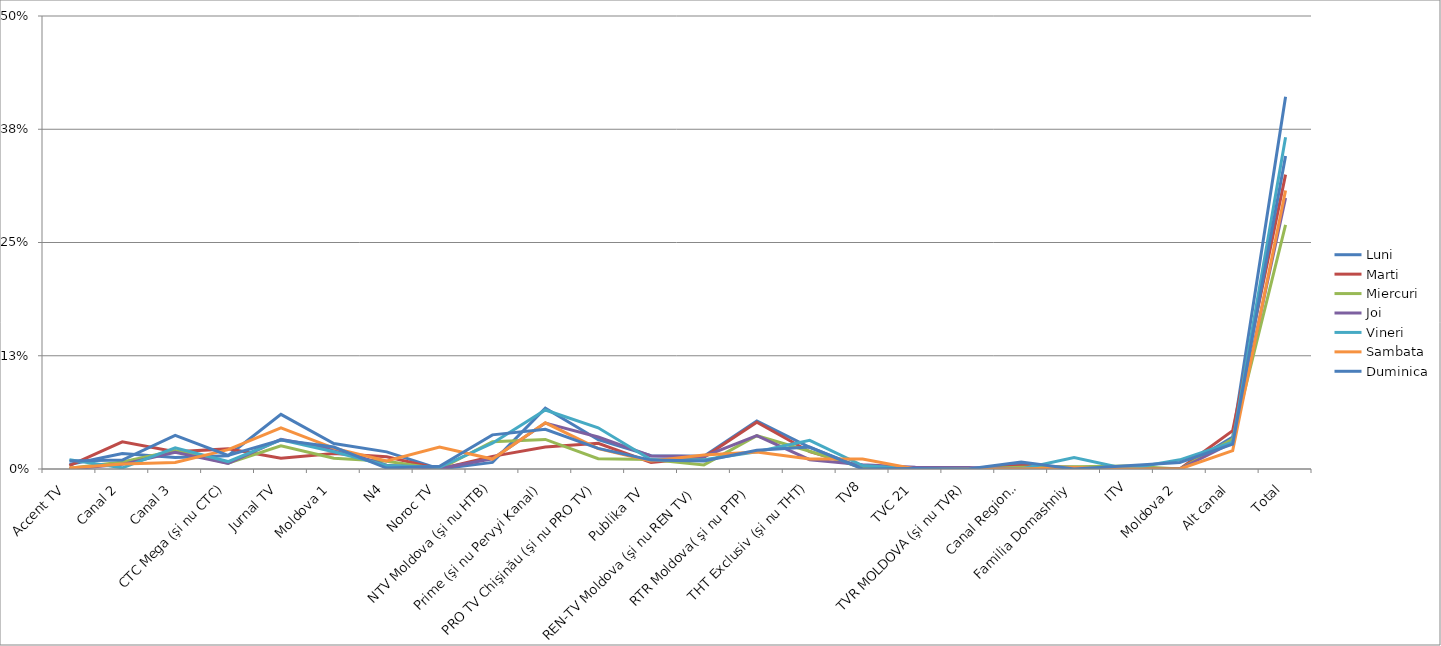
| Category | Luni | Marti | Miercuri | Joi | Vineri | Sambata | Duminica |
|---|---|---|---|---|---|---|---|
| Accent TV | 0.005 | 0.004 | 0.001 | 0 | 0.01 | 0.001 | 0.009 |
| Canal 2 | 0.017 | 0.03 | 0.008 | 0.005 | 0.001 | 0.005 | 0.01 |
| Canal 3 | 0.013 | 0.019 | 0.02 | 0.018 | 0.023 | 0.007 | 0.037 |
| CTC Mega (şi nu CTC) | 0.015 | 0.022 | 0.007 | 0.006 | 0.008 | 0.021 | 0.015 |
| Jurnal TV | 0.06 | 0.012 | 0.026 | 0.033 | 0.032 | 0.045 | 0.032 |
| Moldova 1 | 0.028 | 0.017 | 0.012 | 0.022 | 0.019 | 0.023 | 0.024 |
| N4 | 0.019 | 0.013 | 0.009 | 0.004 | 0.004 | 0.009 | 0.001 |
| Noroc TV | 0 | 0 | 0 | 0.001 | 0.002 | 0.024 | 0.003 |
| NTV Moldova (şi nu HTB) | 0.007 | 0.014 | 0.03 | 0.011 | 0.028 | 0.011 | 0.038 |
| Prime (şi nu Pervyi Kanal) | 0.067 | 0.024 | 0.033 | 0.051 | 0.065 | 0.051 | 0.044 |
| PRO TV Chişinău (şi nu PRO TV) | 0.032 | 0.028 | 0.011 | 0.035 | 0.046 | 0.022 | 0.023 |
| Publika TV  | 0.015 | 0.007 | 0.011 | 0.014 | 0.01 | 0.009 | 0.01 |
| REN-TV Moldova (şi nu REN TV)  | 0.014 | 0.013 | 0.004 | 0.014 | 0.01 | 0.015 | 0.009 |
| RTR Moldova( şi nu PTP)  | 0.053 | 0.052 | 0.037 | 0.037 | 0.019 | 0.019 | 0.021 |
| THT Exclusiv (şi nu THT) | 0.024 | 0.019 | 0.02 | 0.01 | 0.032 | 0.011 | 0.024 |
| TV8 | 0.001 | 0.002 | 0.001 | 0.005 | 0.004 | 0.011 | 0 |
| TVC 21 | 0 | 0 | 0 | 0.002 | 0 | 0 | 0.001 |
| TVR MOLDOVA (şi nu TVR) | 0 | 0 | 0 | 0.002 | 0 | 0 | 0 |
| Canal Regional | 0.005 | 0.004 | 0.002 | 0 | 0 | 0 | 0.008 |
| Familia Domashniy | 0 | 0.002 | 0.002 | 0 | 0.013 | 0.002 | 0 |
| ITV | 0 | 0 | 0.003 | 0 | 0 | 0 | 0.004 |
| Moldova 2 | 0 | 0 | 0 | 0 | 0.01 | 0 | 0.007 |
| Alt canal | 0.035 | 0.042 | 0.033 | 0.029 | 0.03 | 0.02 | 0.027 |
| Total | 0.411 | 0.325 | 0.269 | 0.299 | 0.366 | 0.307 | 0.346 |